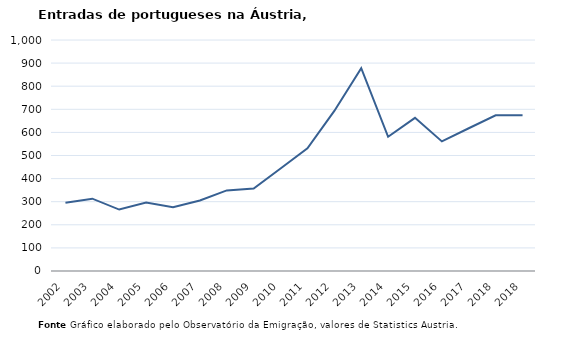
| Category | Entradas |
|---|---|
| 2002.0 | 295 |
| 2003.0 | 313 |
| 2004.0 | 266 |
| 2005.0 | 296 |
| 2006.0 | 276 |
| 2007.0 | 305 |
| 2008.0 | 349 |
| 2009.0 | 357 |
| 2010.0 | 444 |
| 2011.0 | 531 |
| 2012.0 | 693 |
| 2013.0 | 878 |
| 2014.0 | 581 |
| 2015.0 | 663 |
| 2016.0 | 561 |
| 2017.0 | 618 |
| 2018.0 | 674 |
| 2018.0 | 674 |